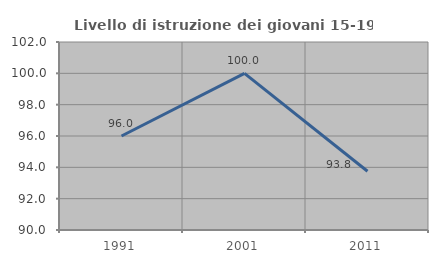
| Category | Livello di istruzione dei giovani 15-19 anni |
|---|---|
| 1991.0 | 96 |
| 2001.0 | 100 |
| 2011.0 | 93.75 |